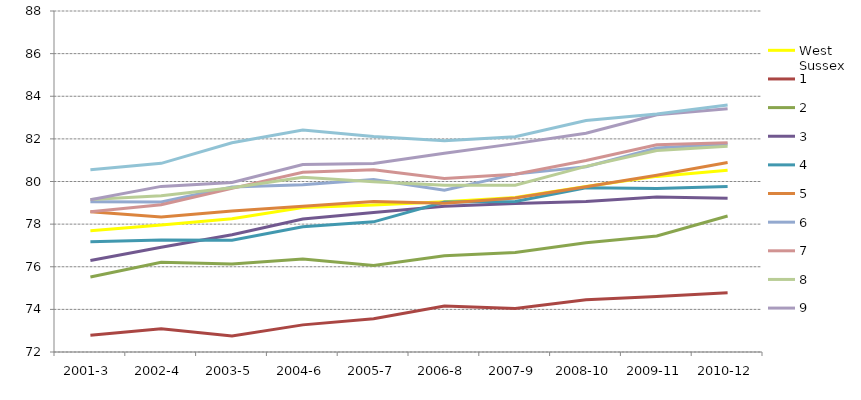
| Category | West Sussex | 1 | 2 | 3 | 4 | 5 | 6 | 7 | 8 | 9 | 10 |
|---|---|---|---|---|---|---|---|---|---|---|---|
| 2001-3 | 77.692 | 72.79 | 75.522 | 76.296 | 77.168 | 78.585 | 79.045 | 78.584 | 79.153 | 79.146 | 80.554 |
| 2002-4 | 77.954 | 73.093 | 76.211 | 76.912 | 77.253 | 78.338 | 79.039 | 78.91 | 79.332 | 79.771 | 80.853 |
| 2003-5 | 78.251 | 72.751 | 76.132 | 77.498 | 77.244 | 78.612 | 79.747 | 79.676 | 79.708 | 79.95 | 81.819 |
| 2004-6 | 78.785 | 73.273 | 76.368 | 78.24 | 77.878 | 78.843 | 79.844 | 80.436 | 80.196 | 80.794 | 82.414 |
| 2005-7 | 78.894 | 73.558 | 76.058 | 78.55 | 78.108 | 79.06 | 80.092 | 80.554 | 79.991 | 80.844 | 82.117 |
| 2006-8 | 79.051 | 74.155 | 76.517 | 78.838 | 79.034 | 78.978 | 79.595 | 80.138 | 79.822 | 81.326 | 81.907 |
| 2007-9 | 79.248 | 74.042 | 76.668 | 78.968 | 79.061 | 79.23 | 80.347 | 80.337 | 79.821 | 81.778 | 82.105 |
| 2008-10 | 79.767 | 74.455 | 77.126 | 79.063 | 79.711 | 79.75 | 80.694 | 80.984 | 80.711 | 82.266 | 82.865 |
| 2009-11 | 80.24 | 74.603 | 77.444 | 79.272 | 79.672 | 80.294 | 81.573 | 81.725 | 81.451 | 83.135 | 83.172 |
| 2010-12 | 80.529 | 74.783 | 78.379 | 79.213 | 79.762 | 80.89 | 81.761 | 81.814 | 81.654 | 83.417 | 83.591 |